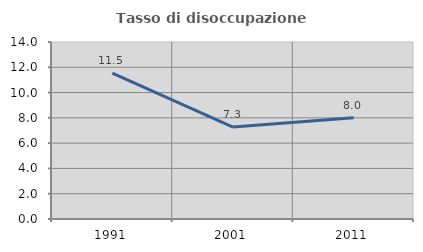
| Category | Tasso di disoccupazione giovanile  |
|---|---|
| 1991.0 | 11.538 |
| 2001.0 | 7.273 |
| 2011.0 | 8 |